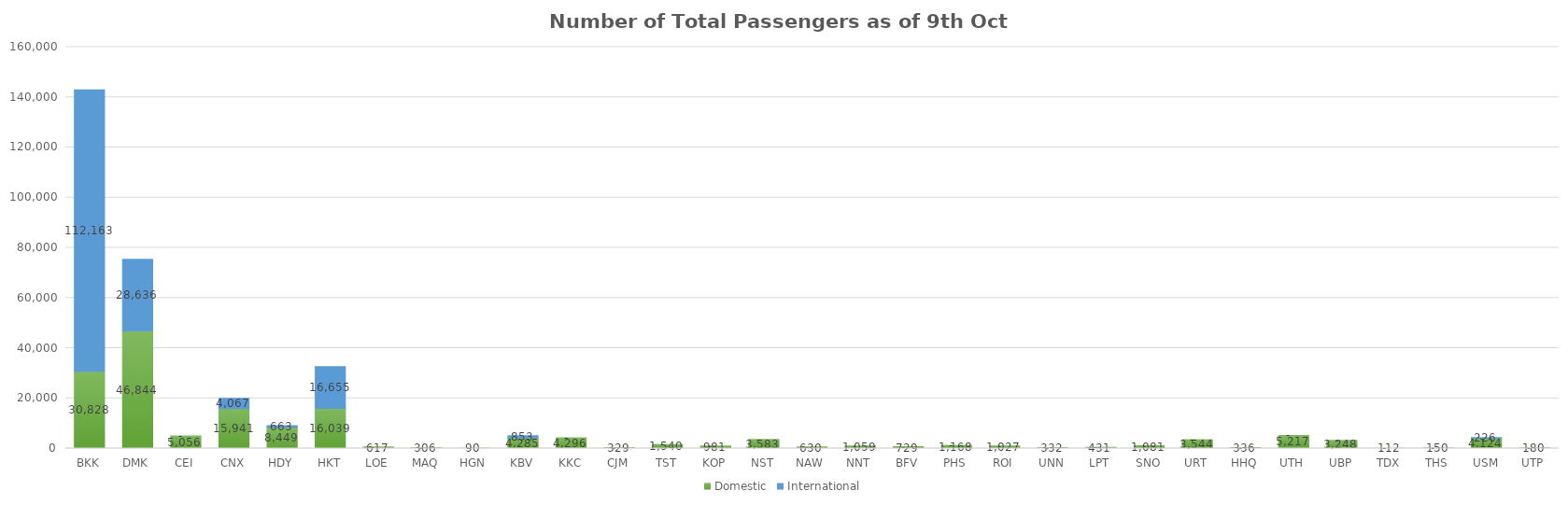
| Category | Domestic | International |
|---|---|---|
| BKK | 30828 | 112163 |
| DMK | 46844 | 28636 |
| CEI | 5056 | 0 |
| CNX | 15941 | 4067 |
| HDY | 8449 | 663 |
| HKT | 16039 | 16655 |
| LOE | 617 | 0 |
| MAQ | 306 | 0 |
| HGN | 90 | 0 |
| KBV | 4285 | 853 |
| KKC | 4296 | 0 |
| CJM | 329 | 0 |
| TST | 1540 | 0 |
| KOP | 981 | 0 |
| NST | 3583 | 0 |
| NAW | 630 | 0 |
| NNT | 1059 | 0 |
| BFV | 729 | 0 |
| PHS | 1168 | 0 |
| ROI | 1027 | 0 |
| UNN | 332 | 0 |
| LPT | 431 | 0 |
| SNO | 1081 | 0 |
| URT | 3544 | 0 |
| HHQ | 336 | 0 |
| UTH | 5217 | 0 |
| UBP | 3248 | 0 |
| TDX | 112 | 0 |
| THS | 150 | 0 |
| USM | 4124 | 226 |
| UTP | 180 | 0 |